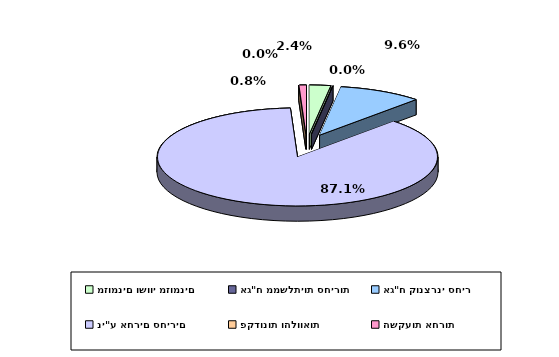
| Category | Series 0 |
|---|---|
| מזומנים ושווי מזומנים | 0.024 |
| אג"ח ממשלתיות סחירות | 0 |
| אג"ח קונצרני סחיר | 0.096 |
| ני"ע אחרים סחירים | 0.871 |
| פקדונות והלוואות | 0 |
| השקעות אחרות | 0.008 |